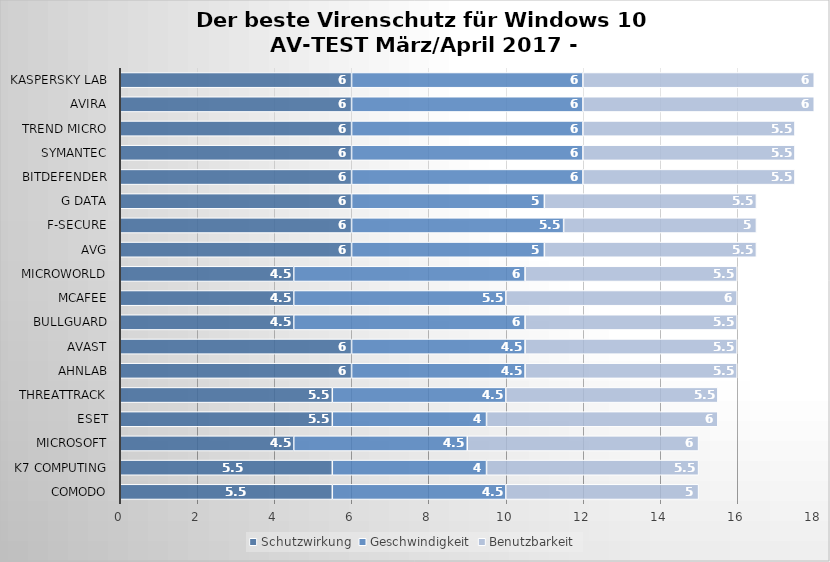
| Category | Schutzwirkung | Geschwindigkeit | Benutzbarkeit |
|---|---|---|---|
| Comodo | 5.5 | 4.5 | 5 |
| K7 Computing | 5.5 | 4 | 5.5 |
| Microsoft | 4.5 | 4.5 | 6 |
| ESET | 5.5 | 4 | 6 |
| ThreatTrack | 5.5 | 4.5 | 5.5 |
| AhnLab | 6 | 4.5 | 5.5 |
| Avast | 6 | 4.5 | 5.5 |
| BullGuard | 4.5 | 6 | 5.5 |
| McAfee | 4.5 | 5.5 | 6 |
| Microworld | 4.5 | 6 | 5.5 |
| AVG | 6 | 5 | 5.5 |
| F-Secure | 6 | 5.5 | 5 |
| G Data | 6 | 5 | 5.5 |
| Bitdefender | 6 | 6 | 5.5 |
| Symantec | 6 | 6 | 5.5 |
| Trend Micro | 6 | 6 | 5.5 |
| Avira | 6 | 6 | 6 |
| Kaspersky Lab | 6 | 6 | 6 |